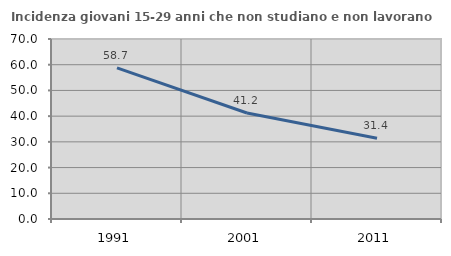
| Category | Incidenza giovani 15-29 anni che non studiano e non lavorano  |
|---|---|
| 1991.0 | 58.742 |
| 2001.0 | 41.212 |
| 2011.0 | 31.429 |